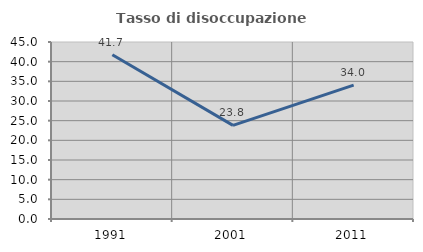
| Category | Tasso di disoccupazione giovanile  |
|---|---|
| 1991.0 | 41.748 |
| 2001.0 | 23.81 |
| 2011.0 | 34.043 |